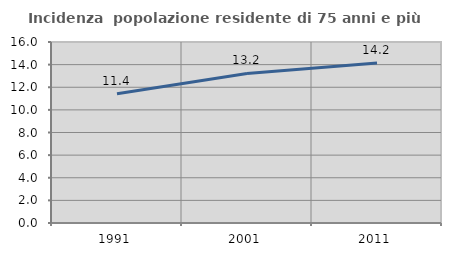
| Category | Incidenza  popolazione residente di 75 anni e più |
|---|---|
| 1991.0 | 11.421 |
| 2001.0 | 13.222 |
| 2011.0 | 14.151 |